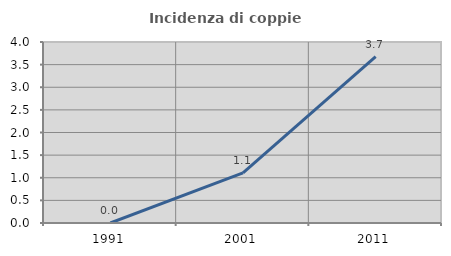
| Category | Incidenza di coppie miste |
|---|---|
| 1991.0 | 0 |
| 2001.0 | 1.107 |
| 2011.0 | 3.676 |